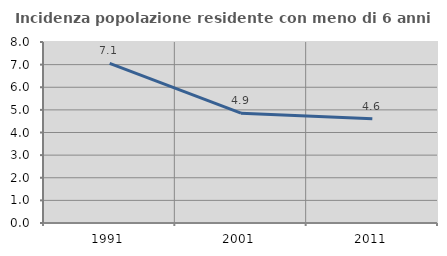
| Category | Incidenza popolazione residente con meno di 6 anni |
|---|---|
| 1991.0 | 7.058 |
| 2001.0 | 4.856 |
| 2011.0 | 4.609 |